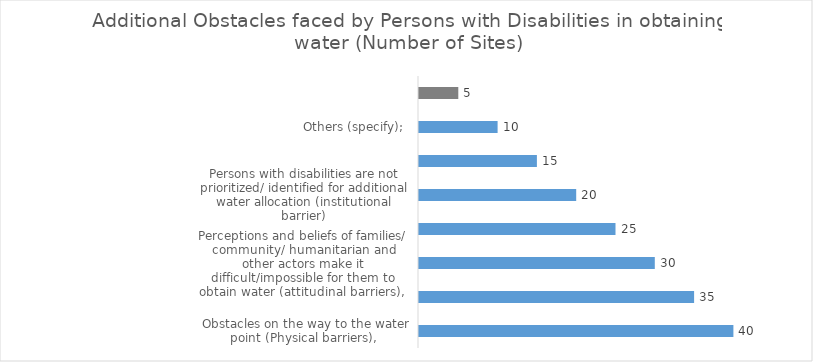
| Category | Additional Obstacles faced by Persons with Disabilities in obtaining water |
|---|---|
| Obstacles on the way to the water point (Physical barriers),  | 40 |
| Obstacles at the water point  (Physical barriers),  | 35 |
| Perceptions and beliefs of families/ community/ humanitarian and other actors make it difficult/impossible for them to obtain water (attitudinal barriers),  | 30 |
| Fear of harassment/violence on the way or at the water point (attitudinal barriers), | 25 |
| Persons with disabilities are not prioritized/ identified for additional water allocation (institutional barrier) | 20 |
| Persons with disabilities do not face any additional obstacle compared to everybody else;  | 15 |
| Others (specify);  | 10 |
| Do not Know /No answer | 5 |